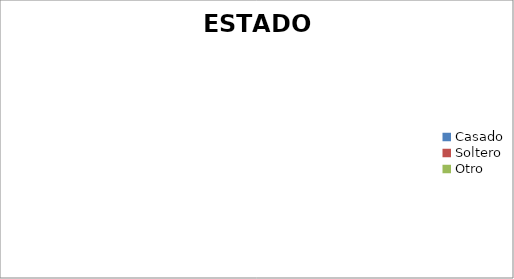
| Category | Edo. Civil |
|---|---|
| Casado | 0 |
| Soltero | 0 |
| Otro | 0 |